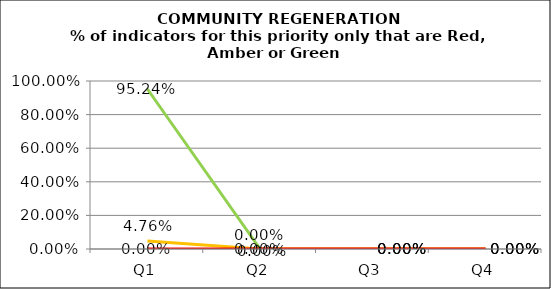
| Category | Green | Amber | Red |
|---|---|---|---|
| Q1 | 0.952 | 0.048 | 0 |
| Q2 | 0 | 0 | 0 |
| Q3 | 0 | 0 | 0 |
| Q4 | 0 | 0 | 0 |